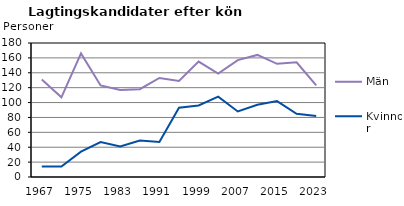
| Category | Män | Kvinnor |
|---|---|---|
| 1967.0 | 131 | 14 |
| 1971.0 | 107 | 14 |
| 1975.0 | 166 | 34 |
| 1979.0 | 123 | 47 |
| 1983.0 | 117 | 41 |
| 1987.0 | 118 | 49 |
| 1991.0 | 133 | 47 |
| 1995.0 | 129 | 93 |
| 1999.0 | 155 | 96 |
| 2003.0 | 139 | 108 |
| 2007.0 | 157 | 88 |
| 2011.0 | 164 | 97 |
| 2015.0 | 152 | 102 |
| 2019.0 | 154 | 85 |
| 2023.0 | 123 | 82 |